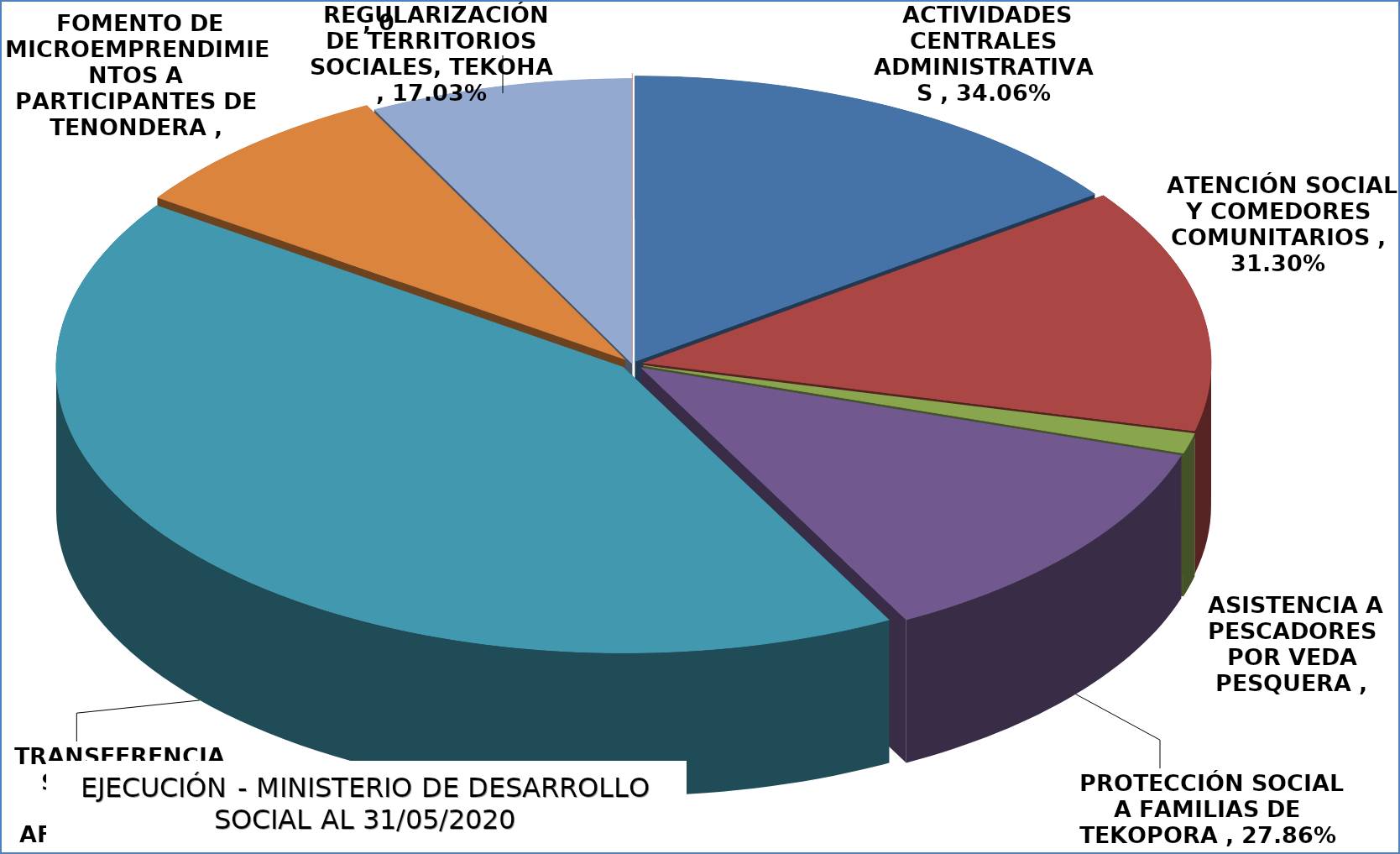
| Category | EJECUCIÓN - MINISTERIO DE DESARROLLO SOCIAL |
|---|---|
| ACTIVIDADES CENTRALES ADMINISTRATIVAS | 0.341 |
| ATENCIÓN SOCIAL Y COMEDORES COMUNITARIOS | 0.313 |
| ASISTENCIA A PESCADORES POR VEDA PESQUERA | 0.026 |
| PROTECCIÓN SOCIAL A FAMILIAS DE TEKOPORA | 0.279 |
| TRANSFERENCIAS MONET. A FAMILIAS AFECTADS POR COVID-19 | 0.96 |
| FOMENTO DE MICROEMPRENDIMIENTOS A PARTICIPANTES DE TENONDERA | 0.179 |
| REGULARIZACIÓN DE TERRITORIOS SOCIALES, TEKOHA | 0.17 |